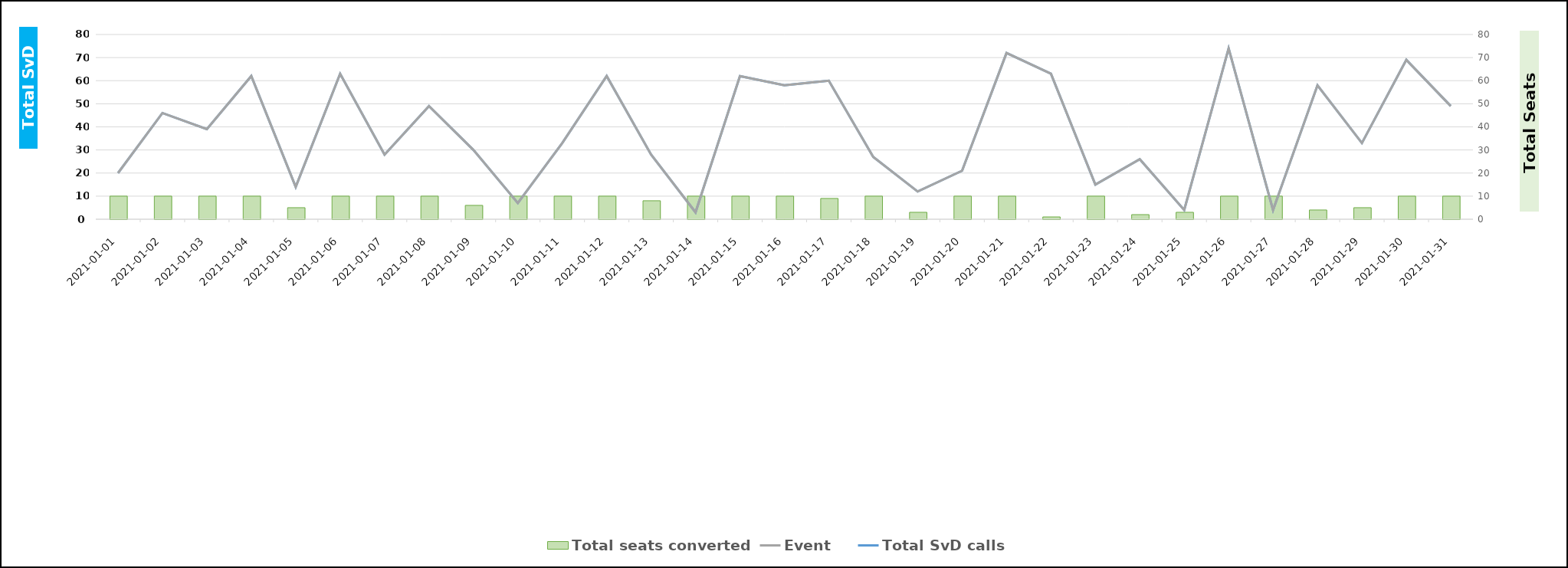
| Category | Total seats converted |
|---|---|
| 0 | 10 |
| 1/1/00 | 10 |
| 1/2/00 | 10 |
| 1/3/00 | 10 |
| 1/4/00 | 5 |
| 1/5/00 | 10 |
| 1/6/00 | 10 |
| 1/7/00 | 10 |
| 1/8/00 | 6 |
| 1/9/00 | 10 |
| 1/10/00 | 10 |
| 1/11/00 | 10 |
| 1/12/00 | 8 |
| 1/13/00 | 10 |
| 1/14/00 | 10 |
| 1/15/00 | 10 |
| 1/16/00 | 9 |
| 1/17/00 | 10 |
| 1/18/00 | 3 |
| 1/19/00 | 10 |
| 1/20/00 | 10 |
| 1/21/00 | 1 |
| 1/22/00 | 10 |
| 1/23/00 | 2 |
| 1/24/00 | 3 |
| 1/25/00 | 10 |
| 1/26/00 | 10 |
| 1/27/00 | 4 |
| 1/28/00 | 5 |
| 1/29/00 | 10 |
| 1/30/00 | 10 |